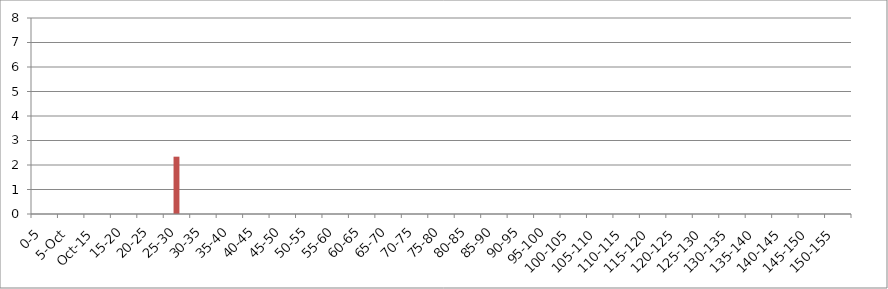
| Category | 119875 | 146067 | 241240 |
|---|---|---|---|
| 0-5 | 0 | 0 | 0 |
| 5-Oct | 0 | 0 | 0 |
| Oct-15 | 0 | 0 | 0 |
| 15-20 | 0 | 0 | 0 |
| 20-25 | 0 | 0 | 0 |
| 25-30 | 0 | 2.34 | 0 |
| 30-35 | 0 | 0 | 0 |
| 35-40 | 0 | 0 | 0 |
| 40-45 | 0 | 0 | 0 |
| 45-50 | 0 | 0 | 0 |
| 50-55 | 0 | 0 | 0 |
| 55-60 | 0 | 0 | 0 |
| 60-65 | 0 | 0 | 0 |
| 65-70 | 0 | 0 | 0 |
| 70-75 | 0 | 0 | 0 |
| 75-80 | 0 | 0 | 0 |
| 80-85 | 0 | 0 | 0 |
| 85-90 | 0 | 0 | 0 |
| 90-95 | 0 | 0 | 0 |
| 95-100 | 0 | 0 | 0 |
| 100-105 | 0 | 0 | 0 |
| 105-110 | 0 | 0 | 0 |
| 110-115 | 0 | 0 | 0 |
| 115-120 | 0 | 0 | 0 |
| 120-125 | 0 | 0 | 0 |
| 125-130 | 0 | 0 | 0 |
| 130-135 | 0 | 0 | 0 |
| 135-140 | 0 | 0 | 0 |
| 140-145 | 0 | 0 | 0 |
| 145-150 | 0 | 0 | 0 |
| 150-155 | 0 | 0 | 0 |